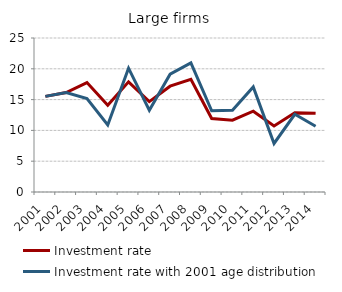
| Category | Investment rate | Investment rate with 2001 age distribution |
|---|---|---|
| 2001.0 | 15.528 | 15.528 |
| 2002.0 | 16.145 | 16.151 |
| 2003.0 | 17.77 | 15.159 |
| 2004.0 | 14.081 | 10.883 |
| 2005.0 | 17.878 | 20.096 |
| 2006.0 | 14.669 | 13.275 |
| 2007.0 | 17.178 | 19.127 |
| 2008.0 | 18.295 | 20.97 |
| 2009.0 | 11.932 | 13.179 |
| 2010.0 | 11.653 | 13.274 |
| 2011.0 | 13.123 | 17.051 |
| 2012.0 | 10.722 | 7.874 |
| 2013.0 | 12.882 | 12.619 |
| 2014.0 | 12.787 | 10.681 |